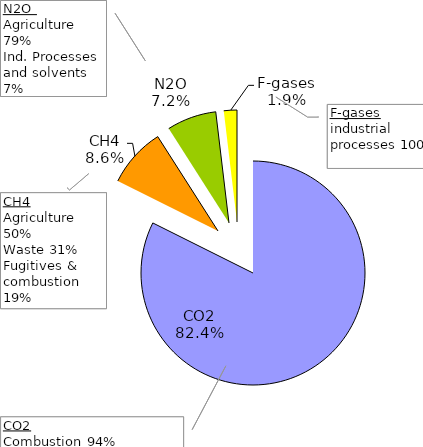
| Category | Series 0 |
|---|---|
| CO2 | 3891336.416 |
| CH4 | 405335.077 |
| N2O | 337995.16 |
| F-gases | 89255.897 |